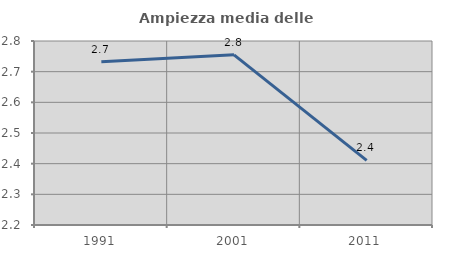
| Category | Ampiezza media delle famiglie |
|---|---|
| 1991.0 | 2.732 |
| 2001.0 | 2.755 |
| 2011.0 | 2.411 |